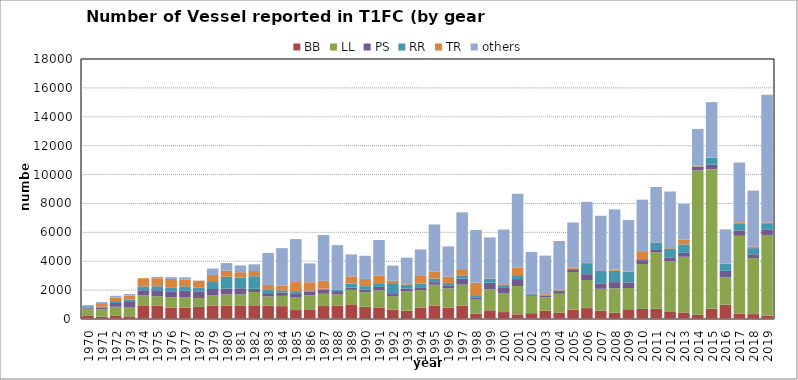
| Category | BB | LL | PS | RR | TR | others |
|---|---|---|---|---|---|---|
| 1970.0 | 214 | 503 | 79 | 91 | 0 | 74 |
| 1971.0 | 157 | 526 | 94 | 79 | 242 | 75 |
| 1972.0 | 247 | 602 | 262 | 129 | 250 | 117 |
| 1973.0 | 184 | 648 | 344 | 151 | 284 | 118 |
| 1974.0 | 905 | 731 | 350 | 269 | 568 | 0 |
| 1975.0 | 918 | 660 | 410 | 279 | 558 | 95 |
| 1976.0 | 776 | 720 | 422 | 274 | 578 | 125 |
| 1977.0 | 778 | 731 | 455 | 296 | 461 | 160 |
| 1978.0 | 838 | 608 | 435 | 306 | 465 | 5 |
| 1979.0 | 912 | 730 | 434 | 544 | 429 | 441 |
| 1980.0 | 935 | 765 | 406 | 819 | 430 | 519 |
| 1981.0 | 912 | 795 | 420 | 746 | 367 | 466 |
| 1982.0 | 950 | 920 | 220 | 870 | 361 | 464 |
| 1983.0 | 919 | 644 | 226 | 215 | 355 | 2213 |
| 1984.0 | 890 | 712 | 228 | 151 | 345 | 2580 |
| 1985.0 | 620 | 904 | 203 | 201 | 628 | 2976 |
| 1986.0 | 627 | 1014 | 252 | 83 | 571 | 1307 |
| 1987.0 | 896 | 851 | 295 | 59 | 547 | 3167 |
| 1988.0 | 921 | 776 | 233 | 81 | 16 | 3084 |
| 1989.0 | 1014 | 1001 | 160 | 269 | 505 | 1521 |
| 1990.0 | 851 | 1008 | 167 | 248 | 500 | 1602 |
| 1991.0 | 803 | 1185 | 235 | 260 | 519 | 2469 |
| 1992.0 | 661 | 921 | 205 | 698 | 161 | 1053 |
| 1993.0 | 573 | 1356 | 182 | 258 | 38 | 1838 |
| 1994.0 | 770 | 1228 | 198 | 258 | 523 | 1842 |
| 1995.0 | 914 | 1459 | 177 | 255 | 466 | 3276 |
| 1996.0 | 782 | 1337 | 176 | 192 | 444 | 2096 |
| 1997.0 | 927 | 1455 | 413 | 192 | 465 | 3936 |
| 1998.0 | 381 | 960 | 125 | 186 | 860 | 3649 |
| 1999.0 | 602 | 1459 | 452 | 266 | 18 | 2851 |
| 2000.0 | 480 | 1304 | 365 | 197 | 58 | 3789 |
| 2001.0 | 322 | 1958 | 485 | 274 | 501 | 5136 |
| 2002.0 | 401 | 1208 | 93 | 63 | 32 | 2847 |
| 2003.0 | 578 | 922 | 96 | 0 | 119 | 2675 |
| 2004.0 | 453 | 1293 | 190 | 41 | 53 | 3369 |
| 2005.0 | 637 | 2609 | 201 | 27 | 75 | 3137 |
| 2006.0 | 754 | 1942 | 407 | 764 | 13 | 4229 |
| 2007.0 | 580 | 1512 | 377 | 852 | 5 | 3821 |
| 2008.0 | 439 | 1692 | 424 | 789 | 83 | 4161 |
| 2009.0 | 676 | 1469 | 388 | 742 | 5 | 3573 |
| 2010.0 | 700 | 3109 | 264 | 78 | 546 | 3566 |
| 2011.0 | 714 | 3898 | 223 | 464 | 10 | 3828 |
| 2012.0 | 488 | 3513 | 264 | 612 | 35 | 3918 |
| 2013.0 | 451 | 3858 | 274 | 582 | 341 | 2459 |
| 2014.0 | 297 | 9991 | 250 | 26 | 74 | 2519 |
| 2015.0 | 703 | 9672 | 308 | 489 | 8 | 3833 |
| 2016.0 | 992 | 1886 | 460 | 471 | 22 | 2375 |
| 2017.0 | 365 | 5397 | 373 | 447 | 117 | 4135 |
| 2018.0 | 339 | 3877 | 264 | 430 | 114 | 3865 |
| 2019.0 | 234 | 5586 | 352 | 462 | 51 | 8847 |